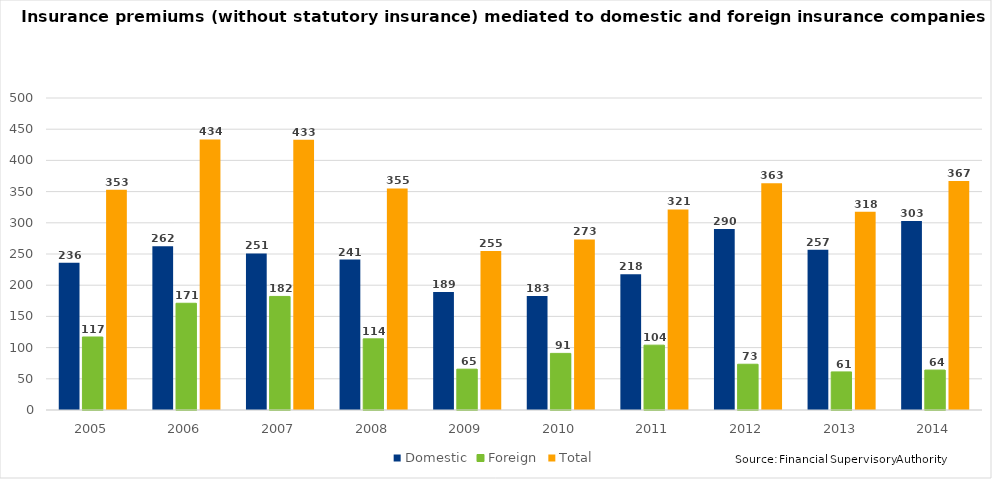
| Category | Domestic | Foreign | Total |
|---|---|---|---|
| 2005.0 | 236 | 117 | 353 |
| 2006.0 | 262.471 | 171.056 | 433.526 |
| 2007.0 | 251 | 182 | 433 |
| 2008.0 | 241 | 114 | 355 |
| 2009.0 | 189.249 | 65.417 | 254.666 |
| 2010.0 | 182.562 | 90.729 | 273.291 |
| 2011.0 | 217.55 | 103.894 | 321.444 |
| 2012.0 | 289.922 | 73.321 | 363.243 |
| 2013.0 | 257 | 61 | 317.523 |
| 2014.0 | 303 | 64 | 367 |